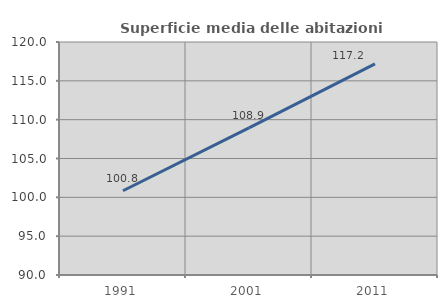
| Category | Superficie media delle abitazioni occupate |
|---|---|
| 1991.0 | 100.844 |
| 2001.0 | 108.943 |
| 2011.0 | 117.188 |